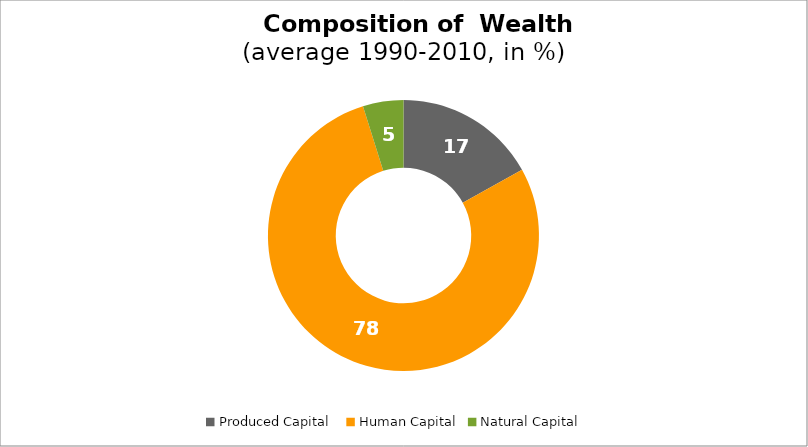
| Category | Series 0 |
|---|---|
| Produced Capital  | 16.942 |
| Human Capital | 78.225 |
| Natural Capital | 4.833 |